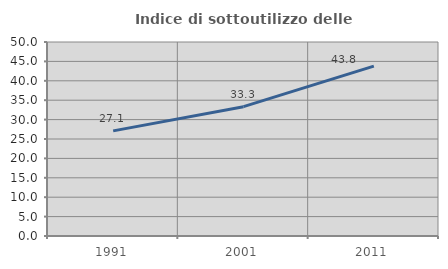
| Category | Indice di sottoutilizzo delle abitazioni  |
|---|---|
| 1991.0 | 27.1 |
| 2001.0 | 33.333 |
| 2011.0 | 43.781 |